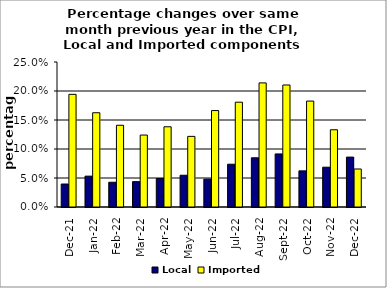
| Category | Local | Imported |
|---|---|---|
| 2021-12-01 | 0.04 | 0.194 |
| 2022-01-01 | 0.053 | 0.163 |
| 2022-02-01 | 0.043 | 0.141 |
| 2022-03-01 | 0.044 | 0.124 |
| 2022-04-01 | 0.049 | 0.138 |
| 2022-05-01 | 0.055 | 0.122 |
| 2022-06-01 | 0.048 | 0.166 |
| 2022-07-01 | 0.074 | 0.181 |
| 2022-08-01 | 0.085 | 0.214 |
| 2022-09-01 | 0.091 | 0.21 |
| 2022-10-01 | 0.062 | 0.183 |
| 2022-11-01 | 0.069 | 0.133 |
| 2022-12-01 | 0.086 | 0.066 |